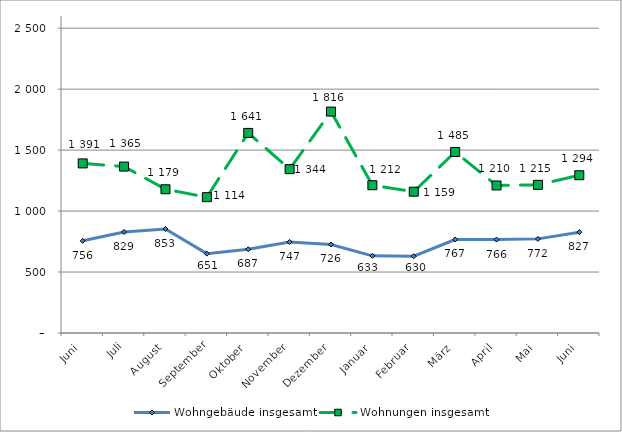
| Category | Wohngebäude insgesamt | Wohnungen insgesamt |
|---|---|---|
| Juni | 756 | 1391 |
| Juli | 829 | 1365 |
| August | 853 | 1179 |
| September | 651 | 1114 |
| Oktober | 687 | 1641 |
| November | 747 | 1344 |
| Dezember | 726 | 1816 |
| Januar | 633 | 1212 |
| Februar | 630 | 1159 |
| März | 767 | 1485 |
| April | 766 | 1210 |
| Mai | 772 | 1215 |
| Juni | 827 | 1294 |